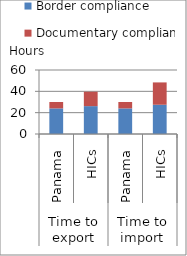
| Category | Border compliance | Documentary compliance |
|---|---|---|
| 0 | 24 | 6 |
| 1 | 26.122 | 13.516 |
| 2 | 24 | 6 |
| 3 | 27.416 | 20.947 |